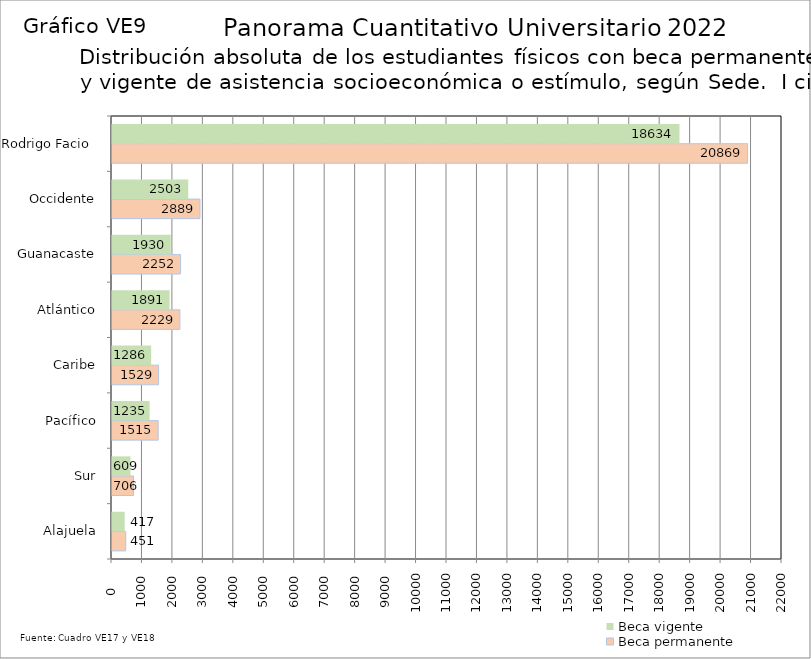
| Category | Beca permanente | Beca vigente |
|---|---|---|
| Alajuela | 451 | 417 |
| Sur | 706 | 609 |
| Pacífico | 1515 | 1235 |
| Caribe | 1529 | 1286 |
| Atlántico | 2229 | 1891 |
| Guanacaste | 2252 | 1930 |
| Occidente | 2889 | 2503 |
| Rodrigo Facio  | 20869 | 18634 |